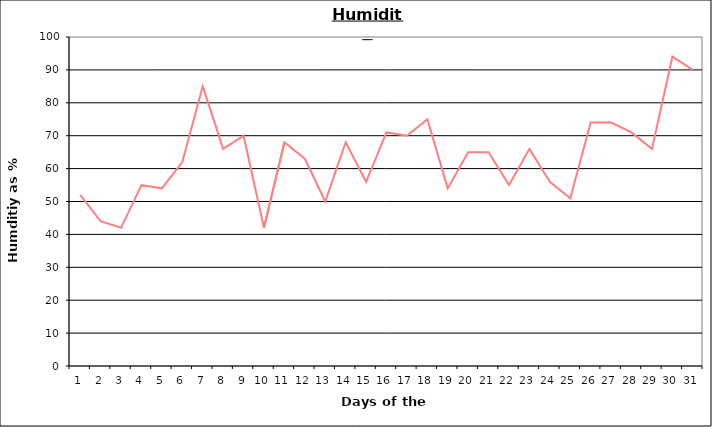
| Category | Series 0 |
|---|---|
| 0 | 52 |
| 1 | 44 |
| 2 | 42 |
| 3 | 55 |
| 4 | 54 |
| 5 | 62 |
| 6 | 85 |
| 7 | 66 |
| 8 | 70 |
| 9 | 42 |
| 10 | 68 |
| 11 | 63 |
| 12 | 50 |
| 13 | 68 |
| 14 | 56 |
| 15 | 71 |
| 16 | 70 |
| 17 | 75 |
| 18 | 54 |
| 19 | 65 |
| 20 | 65 |
| 21 | 55 |
| 22 | 66 |
| 23 | 56 |
| 24 | 51 |
| 25 | 74 |
| 26 | 74 |
| 27 | 71 |
| 28 | 66 |
| 29 | 94 |
| 30 | 90 |